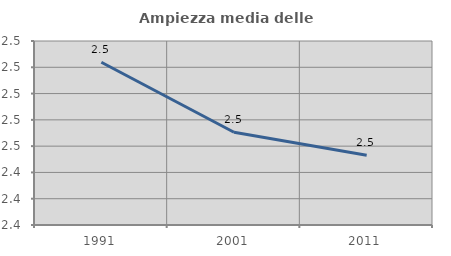
| Category | Ampiezza media delle famiglie |
|---|---|
| 1991.0 | 2.524 |
| 2001.0 | 2.471 |
| 2011.0 | 2.453 |